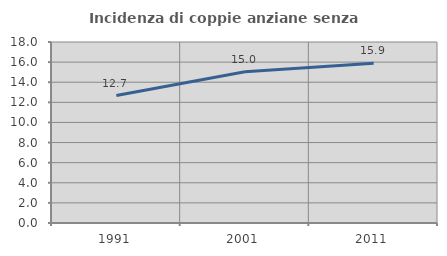
| Category | Incidenza di coppie anziane senza figli  |
|---|---|
| 1991.0 | 12.676 |
| 2001.0 | 15.038 |
| 2011.0 | 15.884 |